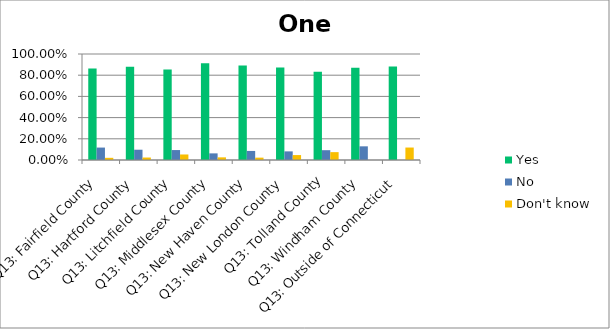
| Category | Yes | No | Don't know |
|---|---|---|---|
| Q13: Fairfield County | 0.862 | 0.117 | 0.02 |
| Q13: Hartford County | 0.88 | 0.097 | 0.023 |
| Q13: Litchfield County | 0.854 | 0.094 | 0.052 |
| Q13: Middlesex County | 0.912 | 0.062 | 0.025 |
| Q13: New Haven County | 0.892 | 0.085 | 0.022 |
| Q13: New London County | 0.872 | 0.081 | 0.047 |
| Q13: Tolland County | 0.833 | 0.093 | 0.074 |
| Q13: Windham County | 0.871 | 0.129 | 0 |
| Q13: Outside of Connecticut | 0.882 | 0 | 0.118 |